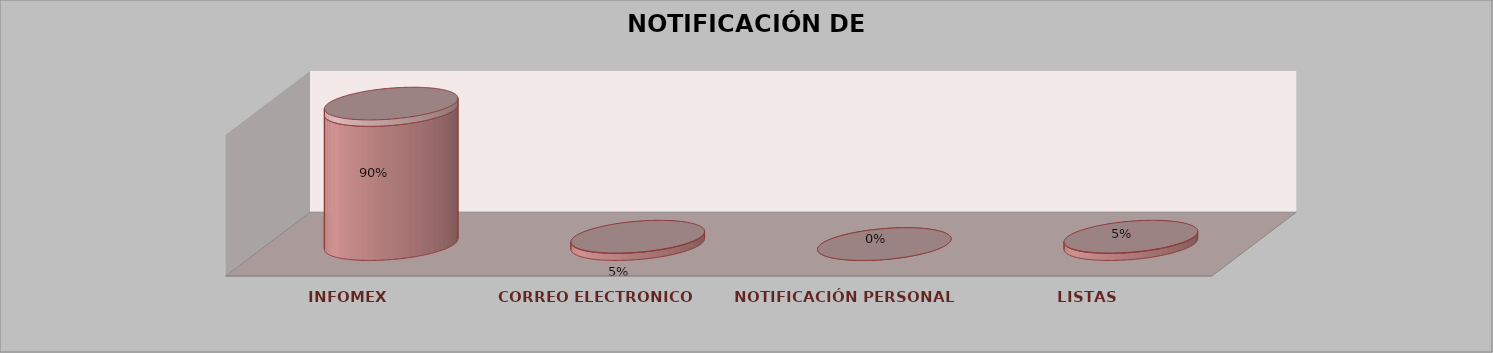
| Category | Series 0 | Series 1 | Series 2 | Series 3 | Series 4 |
|---|---|---|---|---|---|
| INFOMEX |  |  |  | 19 | 0.905 |
| CORREO ELECTRONICO |  |  |  | 1 | 0.048 |
| NOTIFICACIÓN PERSONAL |  |  |  | 0 | 0 |
| LISTAS |  |  |  | 1 | 0.048 |